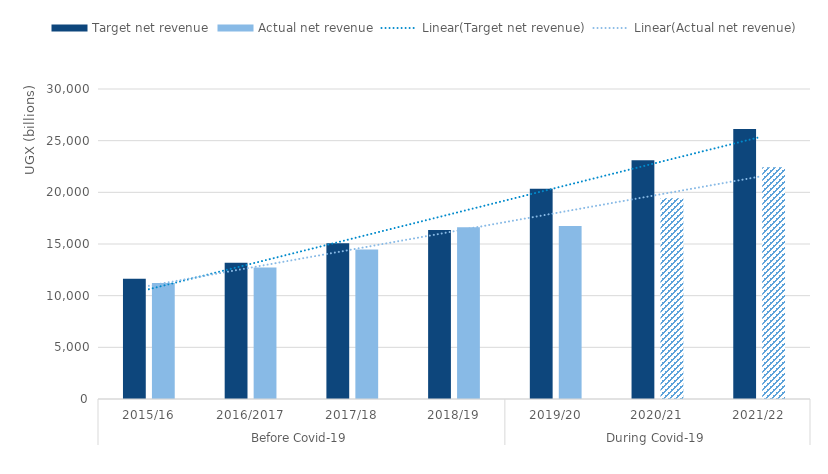
| Category | Target net revenue | Actual net revenue |
|---|---|---|
| 0 | 11635.42 | 11230.87 |
| 1 | 13177.15 | 12719.63 |
| 2 | 15062.43 | 14456.11 |
| 3 | 16358.76 | 16617.65 |
| 4 | 20344.13 | 16751.64 |
| 5 | 23104 | 19432 |
| 6 | 26134 | 22422 |